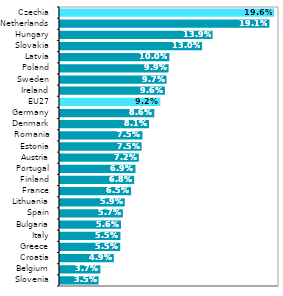
| Category | 2020 |
|---|---|
| Slovenia | 0.035 |
| Belgium | 0.037 |
| Croatia | 0.049 |
| Greece | 0.055 |
| Italy | 0.055 |
| Bulgaria | 0.056 |
| Spain | 0.057 |
| Lithuania | 0.059 |
| France | 0.065 |
| Finland | 0.068 |
| Portugal | 0.069 |
| Austria | 0.072 |
| Estonia | 0.075 |
| Romania | 0.075 |
| Denmark | 0.081 |
| Germany | 0.086 |
| EU27 | 0.092 |
| Ireland | 0.096 |
| Sweden | 0.097 |
| Poland | 0.099 |
| Latvia | 0.1 |
| Slovakia | 0.13 |
| Hungary | 0.139 |
| Netherlands | 0.191 |
| Czechia | 0.196 |